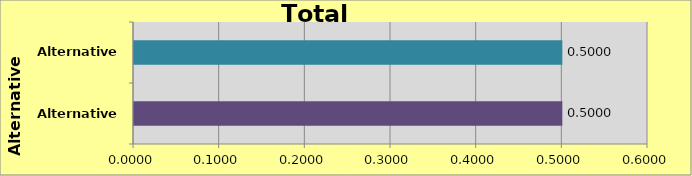
| Category | Alternative C-3 Alternative D-1 |
|---|---|
| Alternative C-3 | 0.5 |
| Alternative D-1 | 0.5 |